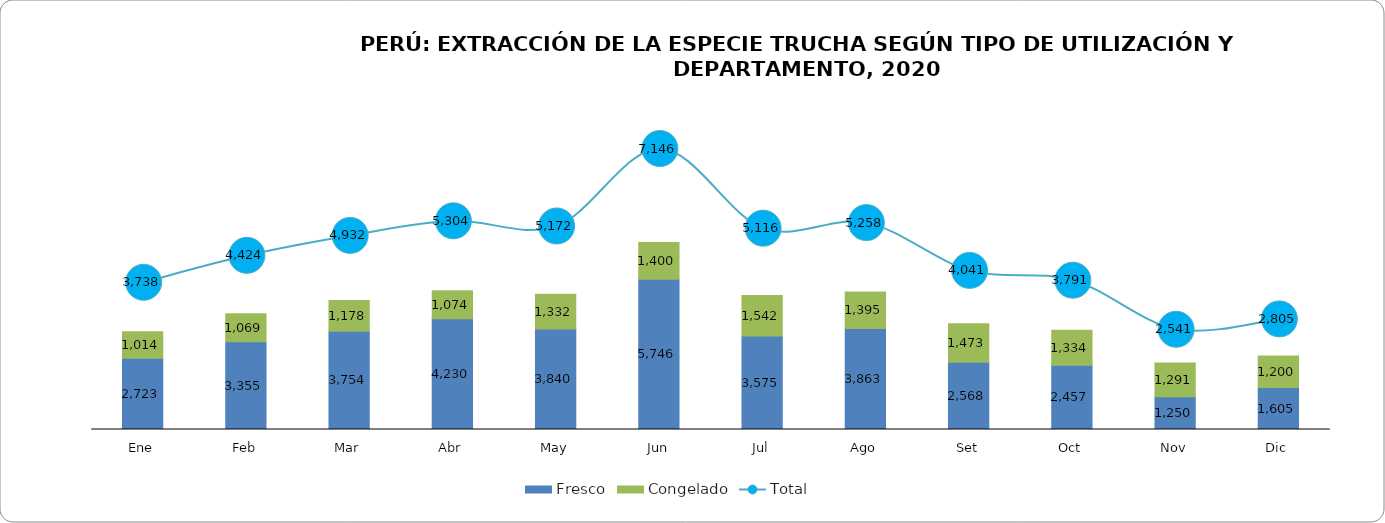
| Category | Fresco | Congelado |
|---|---|---|
| Ene | 2723.48 | 1014.4 |
| Feb | 3354.99 | 1069.43 |
| Mar | 3754.01 | 1178.37 |
| Abr | 4229.8 | 1074.2 |
| May | 3840.49 | 1331.84 |
| Jun | 5745.94 | 1399.98 |
| Jul | 3574.58 | 1541.78 |
| Ago | 3863.17 | 1395.1 |
| Set | 2568.18 | 1472.6 |
| Oct | 2457.18 | 1333.93 |
| Nov | 1250.03 | 1291.33 |
| Dic | 1605 | 1199.66 |